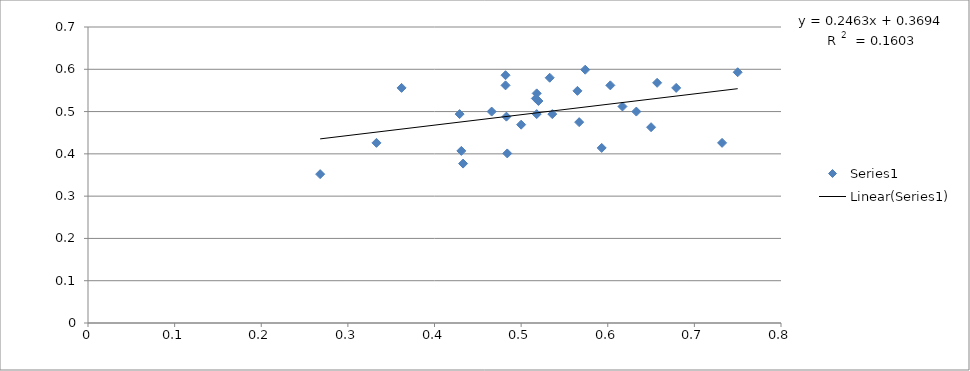
| Category | Series 0 |
|---|---|
| 0.484 | 0.401 |
| 0.603 | 0.562 |
| 0.431 | 0.407 |
| 0.565 | 0.549 |
| 0.65 | 0.463 |
| 0.518 | 0.543 |
| 0.482 | 0.562 |
| 0.732 | 0.426 |
| 0.617 | 0.512 |
| 0.633 | 0.5 |
| 0.518 | 0.494 |
| 0.5 | 0.469 |
| 0.593 | 0.414 |
| 0.536 | 0.494 |
| 0.429 | 0.494 |
| 0.567 | 0.475 |
| 0.533 | 0.58 |
| 0.483 | 0.488 |
| 0.482 | 0.586 |
| 0.466 | 0.5 |
| 0.574 | 0.599 |
| 0.268 | 0.352 |
| 0.679 | 0.556 |
| 0.657 | 0.568 |
| 0.433 | 0.377 |
| 0.517 | 0.531 |
| 0.75 | 0.593 |
| 0.362 | 0.556 |
| 0.52 | 0.525 |
| 0.333 | 0.426 |